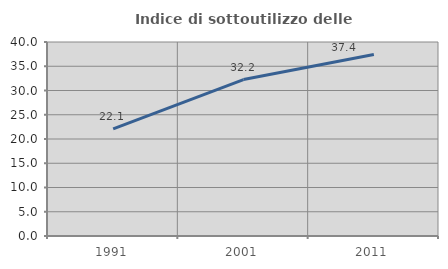
| Category | Indice di sottoutilizzo delle abitazioni  |
|---|---|
| 1991.0 | 22.093 |
| 2001.0 | 32.249 |
| 2011.0 | 37.409 |